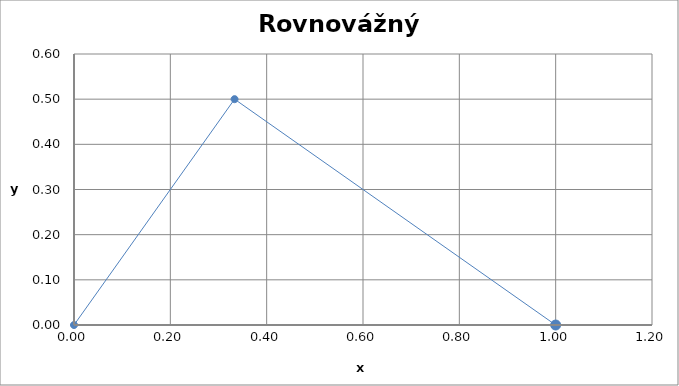
| Category | Rovnovaha |
|---|---|
| 0.0 | 0 |
| 0.3333333333333333 | 0.5 |
| 1.0 | 0 |